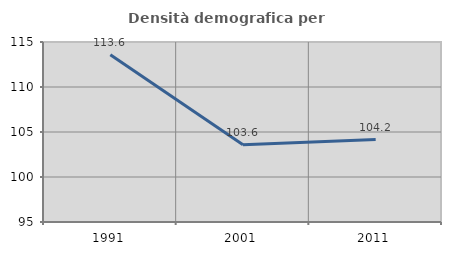
| Category | Densità demografica |
|---|---|
| 1991.0 | 113.582 |
| 2001.0 | 103.574 |
| 2011.0 | 104.166 |